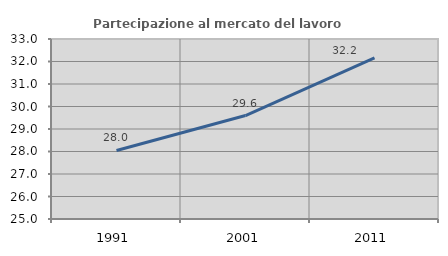
| Category | Partecipazione al mercato del lavoro  femminile |
|---|---|
| 1991.0 | 28.047 |
| 2001.0 | 29.598 |
| 2011.0 | 32.159 |